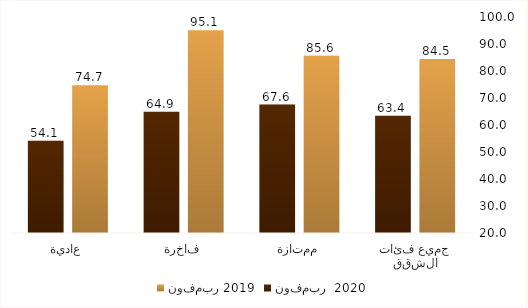
| Category | نوفمبر 2019 | نوفمبر  2020 |
|---|---|---|
| جميع فئات الشقق | 84.47 | 63.447 |
| ممتازة | 85.623 | 67.555 |
| فاخرة | 95.093 | 64.937 |
| عادية | 74.73 | 54.143 |